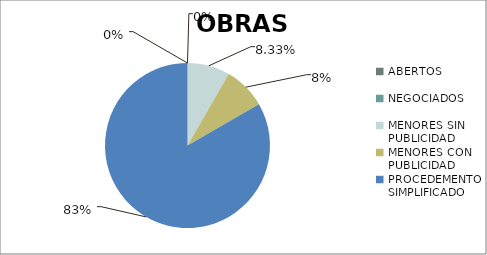
| Category | Series 0 |
|---|---|
| ABERTOS  | 0 |
| NEGOCIADOS  | 0 |
| MENORES SIN PUBLICIDAD | 0.083 |
| MENORES CON PUBLICIDAD | 0.083 |
| PROCEDEMENTO SIMPLIFICADO | 0.833 |